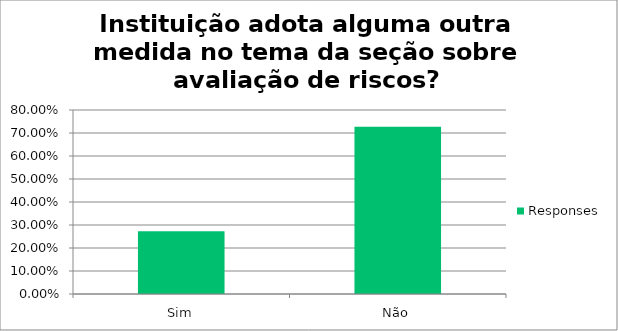
| Category | Responses |
|---|---|
| Sim | 0.273 |
| Não | 0.727 |